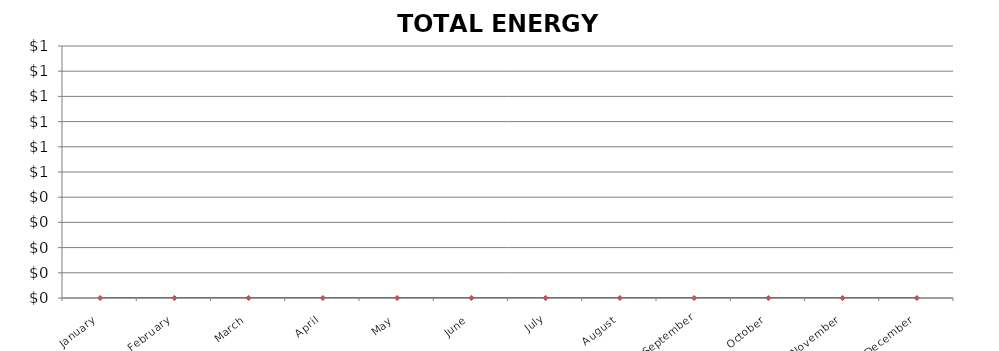
| Category | TOTAL ENERGY COST |
|---|---|
| January | 0 |
| February | 0 |
| March | 0 |
| April | 0 |
| May | 0 |
| June | 0 |
| July | 0 |
| August | 0 |
| September | 0 |
| October | 0 |
| November | 0 |
| December | 0 |